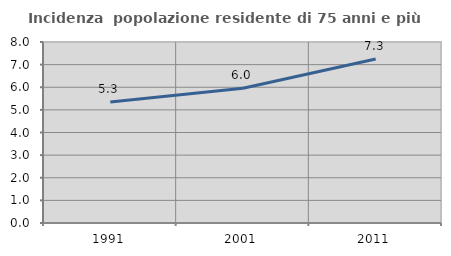
| Category | Incidenza  popolazione residente di 75 anni e più |
|---|---|
| 1991.0 | 5.349 |
| 2001.0 | 5.959 |
| 2011.0 | 7.252 |